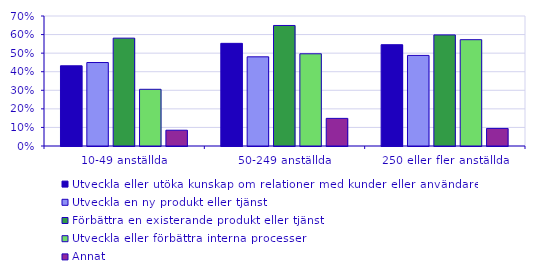
| Category | Utveckla eller utöka kunskap om relationer med kunder eller användare | Utveckla en ny produkt eller tjänst | Förbättra en existerande produkt eller tjänst | Utveckla eller förbättra interna processer  | Annat |
|---|---|---|---|---|---|
| 10-49 anställda | 0.432 | 0.449 | 0.581 | 0.305 | 0.085 |
| 50-249 anställda | 0.553 | 0.48 | 0.649 | 0.497 | 0.149 |
| 250 eller fler anställda | 0.546 | 0.488 | 0.598 | 0.572 | 0.095 |